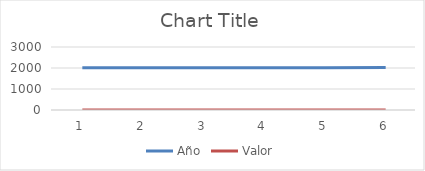
| Category | Año | Valor |
|---|---|---|
| 0 | 2013 | 0 |
| 1 | 2014 | 0 |
| 2 | 2015 | 0 |
| 3 | 2016 | 0 |
| 4 | 2017 | 0 |
| 5 | 2018 | 0 |